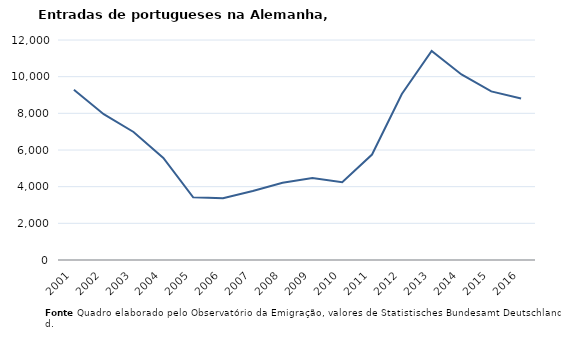
| Category | Entradas |
|---|---|
| 2001.0 | 9287 |
| 2002.0 | 7955 |
| 2003.0 | 6981 |
| 2004.0 | 5570 |
| 2005.0 | 3418 |
| 2006.0 | 3371 |
| 2007.0 | 3766 |
| 2008.0 | 4214 |
| 2009.0 | 4468 |
| 2010.0 | 4238 |
| 2011.0 | 5752 |
| 2012.0 | 9054 |
| 2013.0 | 11401 |
| 2014.0 | 10121 |
| 2015.0 | 9195 |
| 2016.0 | 8810 |